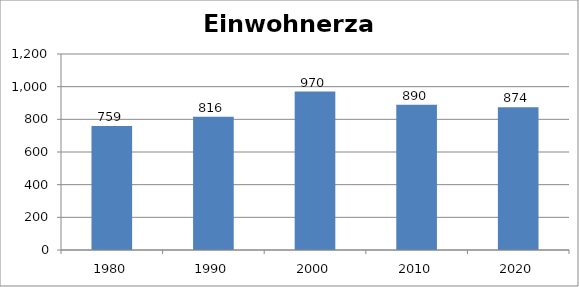
| Category | Einwohnerzahl |
|---|---|
| 1980.0 | 759 |
| 1990.0 | 816 |
| 2000.0 | 970 |
| 2010.0 | 890 |
| 2020.0 | 874 |